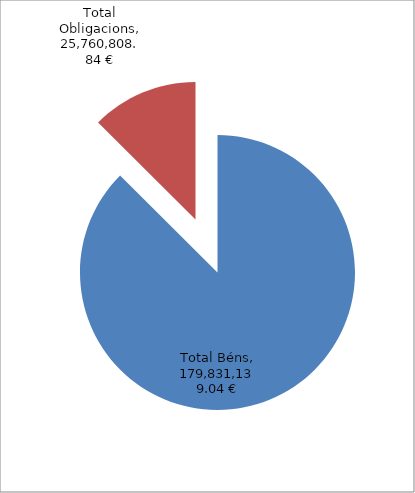
| Category | Series 0 |
|---|---|
| Total Béns | 179831139.04 |
| Total Obligacions | 25760808.84 |